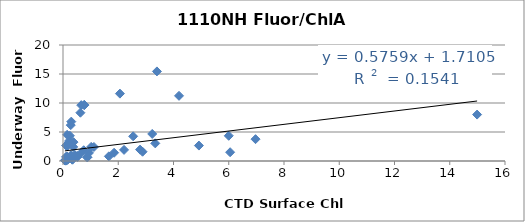
| Category | Series 0 |
|---|---|
| 1.66 | 0.802 |
| 14.99 | 8.002 |
| 1.85 | 1.424 |
| 4.92 | 2.659 |
| 0.31 | 0.55 |
| 0.88 | 0.623 |
| 0.88 | 0.641 |
| 0.34 | 0.479 |
| 0.49 | 0.797 |
| 0.3 | 0.532 |
| 0.23 | 0.494 |
| 0.18 | 0.342 |
| 0.13 | 0.183 |
| 0.34 | 0.242 |
| 0.34 | 0.232 |
| 0.13 | 0.216 |
| 0.13 | 0.22 |
| 0.09 | 0.102 |
| 0.1 | 0.058 |
| 0.07 | 0.094 |
| 0.08 | 0.102 |
| 0.1 | 0.14 |
| 0.12 | 0.19 |
| 0.11 | 0.17 |
| 0.15 | 0.246 |
| 0.16 | 0.208 |
| 0.32 | 0.648 |
| 0.18 | 0.443 |
| 0.43 | 1.018 |
| 0.37 | 0.608 |
| 0.32 | 0.636 |
| 0.94 | 1.398 |
| 2.21 | 1.916 |
| 2.88 | 1.6 |
| 6.05 | 1.513 |
| 6.0 | 4.35 |
| 0.52 | 0.864 |
| 0.65 | 1.341 |
| 3.4 | 15.446 |
| 0.52 | 0.694 |
| 0.3 | 0.606 |
| 0.1 | 0.203 |
| 0.1 | 0.198 |
| 0.19 | 0.364 |
| 0.14 | 0.196 |
| 0.21 | 0.446 |
| 0.13 | 0.474 |
| 0.13 | 0.336 |
| 0.15 | 0.357 |
| 0.14 | 0.792 |
| 0.29 | 0.997 |
| 0.11 | 0.706 |
| 1.02 | 2.435 |
| 1.12 | 2.416 |
| 6.97 | 3.766 |
| 0.75 | 1.854 |
| 2.79 | 1.962 |
| 3.34 | 3.039 |
| 0.37 | 2.429 |
| 3.23 | 4.663 |
| 2.54 | 4.256 |
| 0.38 | 3.257 |
| 0.16 | 2.62 |
| 0.15 | 2.636 |
| 0.11 | 2.674 |
| 0.22 | 3.442 |
| 0.25 | 4.356 |
| 0.15 | 4.512 |
| 0.28 | 6.184 |
| 0.3 | 6.787 |
| 0.63 | 8.326 |
| 0.66 | 9.63 |
| 0.77 | 9.626 |
| 0.77 | 9.682 |
| 4.2 | 11.237 |
| 2.06 | 11.614 |